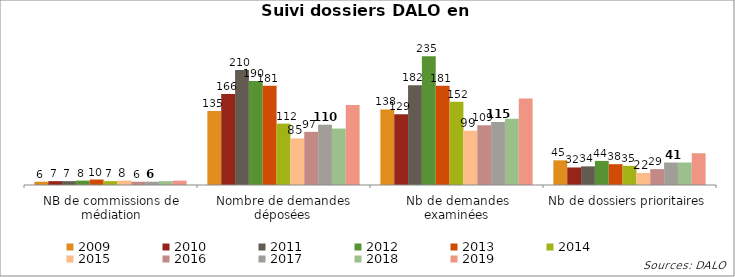
| Category | 2009 | 2010 | 2011 | 2012 | 2013 | 2014 | 2015 | 2016 | 2017 | 2018 | 2019 |
|---|---|---|---|---|---|---|---|---|---|---|---|
| NB de commissions de médiation | 6 | 7 | 7 | 8 | 10 | 7 | 8 | 6 | 6 | 7 | 8 |
| Nombre de demandes déposées | 135 | 166 | 210 | 190 | 181 | 112 | 85 | 97 | 110 | 103 | 146 |
| Nb de demandes examinées | 138 | 129 | 182 | 235 | 181 | 152 | 99 | 109 | 115 | 121 | 158 |
| Nb de dossiers prioritaires | 45 | 32 | 34 | 44 | 38 | 35 | 22 | 29 | 41 | 41 | 58 |